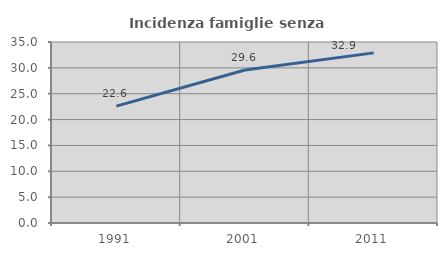
| Category | Incidenza famiglie senza nuclei |
|---|---|
| 1991.0 | 22.594 |
| 2001.0 | 29.585 |
| 2011.0 | 32.895 |